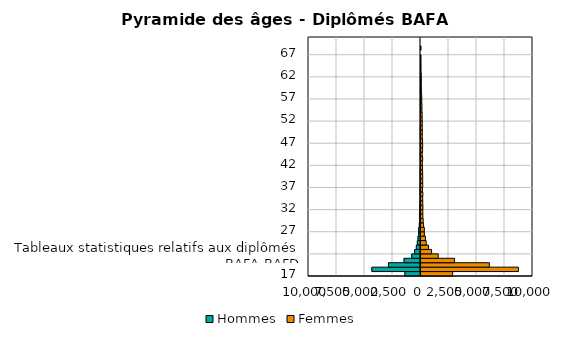
| Category | Hommes | Femmes |
|---|---|---|
| 17 | -1397 | 2825 |
| 18 | -4345 | 8698 |
| 19 | -2858 | 6101 |
| 20 | -1472 | 2985 |
| 21 | -781 | 1538 |
| Tableaux statistiques relatifs aux diplômés BAFA-BAFD | -524 | 947 |
| 23 | -371 | 666 |
| 24 | -282 | 462 |
| 25 | -224 | 396 |
| 26 | -165 | 299 |
| 27 | -160 | 297 |
| 28 | -104 | 231 |
| 29 | -83 | 196 |
| 30 | -94 | 166 |
| 31 | -73 | 162 |
| 32 | -69 | 172 |
| 33 | -51 | 158 |
| 34 | -37 | 152 |
| 35 | -43 | 166 |
| 36 | -43 | 136 |
| 37 | -36 | 157 |
| 38 | -32 | 151 |
| 39 | -34 | 154 |
| 40 | -36 | 145 |
| 41 | -26 | 131 |
| 42 | -16 | 116 |
| 43 | -20 | 147 |
| 44 | -26 | 114 |
| 45 | -10 | 141 |
| 46 | -16 | 148 |
| 47 | -11 | 137 |
| 48 | -17 | 112 |
| 49 | -14 | 119 |
| 50 | -13 | 113 |
| 51 | -6 | 114 |
| 52 | -6 | 106 |
| 53 | -9 | 102 |
| 54 | -6 | 82 |
| 55 | -10 | 88 |
| 56 | -11 | 67 |
| 57 | -1 | 63 |
| 58 | -4 | 32 |
| 59 | -4 | 27 |
| 60 | -1 | 17 |
| 61 | -6 | 22 |
| 62 | -2 | 6 |
| 63 | 0 | 3 |
| 64 | 0 | 3 |
| 65 | 0 | 1 |
| 66 | 0 | 1 |
| 67 | 0 | 0 |
| 68 | 0 | 1 |
| 69 | 0 | 0 |
| 70 | 0 | 0 |